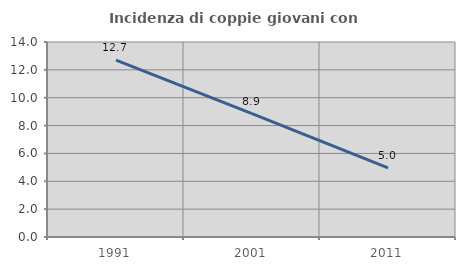
| Category | Incidenza di coppie giovani con figli |
|---|---|
| 1991.0 | 12.696 |
| 2001.0 | 8.852 |
| 2011.0 | 4.957 |